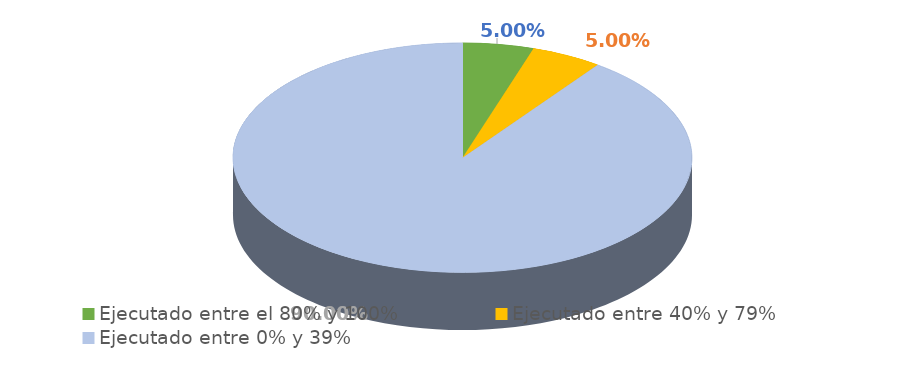
| Category | Series 0 |
|---|---|
| Ejecutado entre el 80% y 100% | 0.05 |
| Ejecutado entre 40% y 79% | 0.05 |
| Ejecutado entre 0% y 39% | 0.9 |